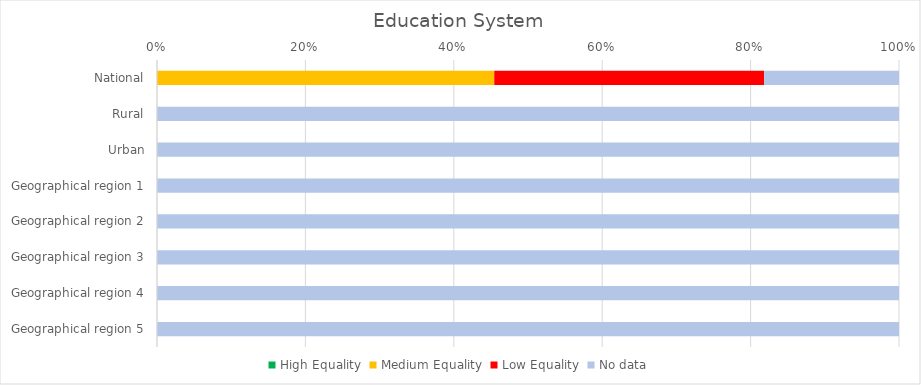
| Category | High Equality | Medium Equality | Low Equality | No data |
|---|---|---|---|---|
| National | 0 | 5 | 4 | 2 |
| Rural | 0 | 0 | 0 | 4 |
| Urban | 0 | 0 | 0 | 4 |
| Geographical region 1 | 0 | 0 | 0 | 4 |
| Geographical region 2 | 0 | 0 | 0 | 4 |
| Geographical region 3 | 0 | 0 | 0 | 4 |
| Geographical region 4 | 0 | 0 | 0 | 4 |
| Geographical region 5 | 0 | 0 | 0 | 4 |